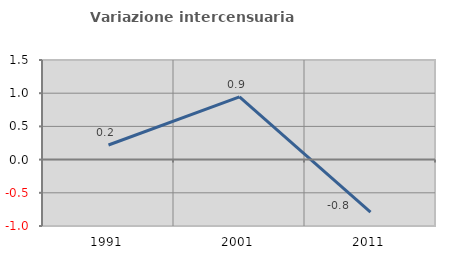
| Category | Variazione intercensuaria annua |
|---|---|
| 1991.0 | 0.22 |
| 2001.0 | 0.944 |
| 2011.0 | -0.793 |